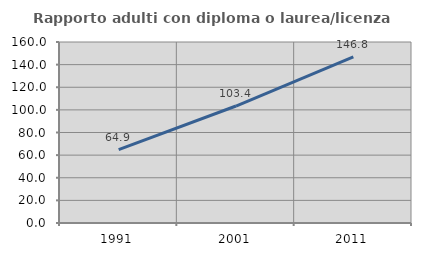
| Category | Rapporto adulti con diploma o laurea/licenza media  |
|---|---|
| 1991.0 | 64.878 |
| 2001.0 | 103.407 |
| 2011.0 | 146.802 |